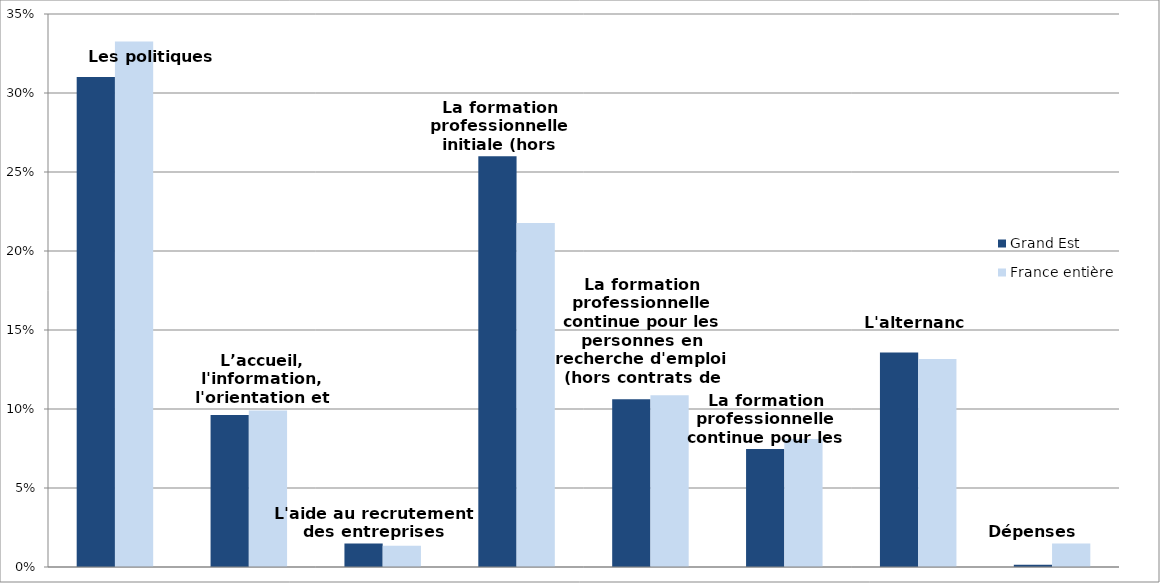
| Category | Grand Est | France entière |
|---|---|---|
| Les politiques d'emploi | 0.31 | 0.333 |
| L’accueil, l'information, l'orientation et l'accompagnement | 0.096 | 0.099 |
| L'aide au recrutement des entreprises | 0.015 | 0.013 |
| La formation professionnelle initiale (hors apprentissage) | 0.26 | 0.218 |
| La formation professionnelle continue pour les personnes en recherche d'emploi (hors contrats de professionnalisation) | 0.106 | 0.109 |
| La formation professionnelle continue pour les actifs occupés | 0.075 | 0.081 |
| L'alternance | 0.136 | 0.132 |
| Dépenses non-ventilables | 0.001 | 0.015 |